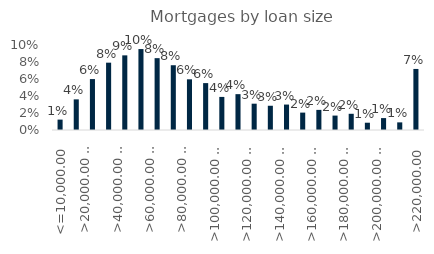
| Category | Series 0 |
|---|---|
|  <=10,000.00 | 0.012 |
| >10,000.00 <=20,000.00 | 0.036 |
| >20,000.00 <=30,000.00 | 0.06 |
| >30,000.00 <=40,000.00 | 0.079 |
| >40,000.00 <=50,000.00 | 0.088 |
| >50,000.00 <=60,000.00 | 0.095 |
| >60,000.00 <=70,000.00 | 0.085 |
| >70,000.00 <=80,000.00 | 0.076 |
| >80,000.00 <=90,000.00 | 0.06 |
| >90,000.00 <=100,000.00 | 0.055 |
| >100,000.00 <=110,000.00 | 0.039 |
| >110,000.00 <=120,000.00 | 0.042 |
| >120,000.00 <=130,000.00 | 0.031 |
| >130,000.00 <=140,000.00 | 0.029 |
| >140,000.00 <=150,000.00 | 0.03 |
| >150,000.00 <=160,000.00 | 0.02 |
| >160,000.00 <=170,000.00 | 0.024 |
| >170,000.00 <=180,000.00 | 0.017 |
| >180,000.00 <=190,000.00 | 0.019 |
| >190,000.00 <=200,000.00 | 0.009 |
| >200,000.00 <=210,000.00 | 0.014 |
| >210,000.00 <=220,000.00 | 0.009 |
| >220,000.00 | 0.072 |